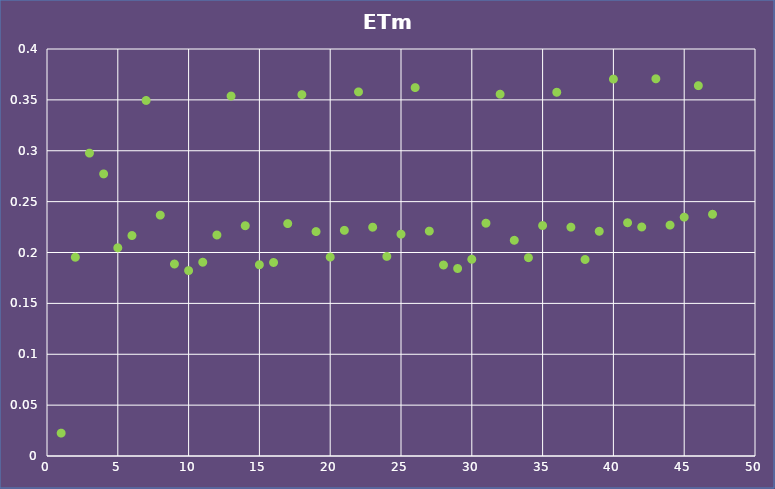
| Category | Series 0 |
|---|---|
| 1.0 | 0.022 |
| 2.0 | 0.195 |
| 3.0 | 0.298 |
| 4.0 | 0.277 |
| 5.0 | 0.205 |
| 6.0 | 0.217 |
| 7.0 | 0.349 |
| 8.0 | 0.237 |
| 9.0 | 0.189 |
| 10.0 | 0.182 |
| 11.0 | 0.19 |
| 12.0 | 0.217 |
| 13.0 | 0.354 |
| 14.0 | 0.226 |
| 15.0 | 0.188 |
| 16.0 | 0.19 |
| 17.0 | 0.228 |
| 18.0 | 0.355 |
| 19.0 | 0.221 |
| 20.0 | 0.196 |
| 21.0 | 0.222 |
| 22.0 | 0.358 |
| 23.0 | 0.225 |
| 24.0 | 0.196 |
| 25.0 | 0.218 |
| 26.0 | 0.362 |
| 27.0 | 0.221 |
| 28.0 | 0.188 |
| 29.0 | 0.184 |
| 30.0 | 0.193 |
| 31.0 | 0.229 |
| 32.0 | 0.356 |
| 33.0 | 0.212 |
| 34.0 | 0.195 |
| 35.0 | 0.226 |
| 36.0 | 0.357 |
| 37.0 | 0.225 |
| 38.0 | 0.193 |
| 39.0 | 0.221 |
| 40.0 | 0.37 |
| 41.0 | 0.229 |
| 42.0 | 0.225 |
| 43.0 | 0.371 |
| 44.0 | 0.227 |
| 45.0 | 0.235 |
| 46.0 | 0.364 |
| 47.0 | 0.238 |